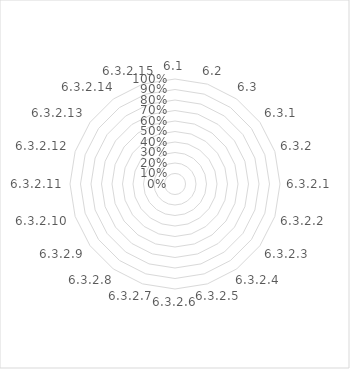
| Category | Series 0 |
|---|---|
| 6.1 | 0 |
| 6.2 | 0 |
| 6.3 | 0 |
| 6.3.1 | 0 |
| 6.3.2 | 0 |
| 6.3.2.1 | 0 |
| 6.3.2.2 | 0 |
| 6.3.2.3 | 0 |
| 6.3.2.4 | 0 |
| 6.3.2.5 | 0 |
| 6.3.2.6 | 0 |
| 6.3.2.7 | 0 |
| 6.3.2.8 | 0 |
| 6.3.2.9 | 0 |
| 6.3.2.10 | 0 |
| 6.3.2.11 | 0 |
| 6.3.2.12 | 0 |
| 6.3.2.13 | 0 |
| 6.3.2.14 | 0 |
| 6.3.2.15 | 0 |